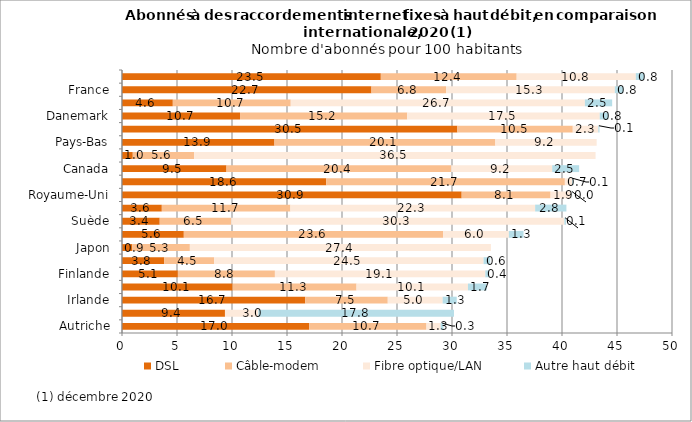
| Category | DSL  | Câble-modem | Fibre optique/LAN | Autre haut débit  |
|---|---|---|---|---|
| Autriche | 17.01 | 10.67 | 1.29 | 0.25 |
| Italie | 9.36 | 0 | 3.03 | 17.79 |
| Irlande | 16.66 | 7.5 | 4.99 | 1.28 |
| OCDE | 10.06 | 11.26 | 10.13 | 1.71 |
| Finlande | 5.08 | 8.82 | 19.13 | 0.35 |
| Espagne | 3.84 | 4.54 | 24.49 | 0.6 |
| Japon | 0.92 | 5.25 | 27.37 | 0 |
| États-Unis | 5.62 | 23.57 | 5.98 | 1.33 |
| Suède | 3.43 | 6.5 | 30.29 | 0.14 |
| Portugal | 3.62 | 11.69 | 22.25 | 2.84 |
| Royaume-Uni | 30.88 | 8.08 | 1.92 | 0.04 |
| Belgique | 18.57 | 21.69 | 0.67 | 0.11 |
| Canada | 9.5 | 20.43 | 9.18 | 2.45 |
| Corée | 0.98 | 5.58 | 36.49 | 0 |
| Pays-Bas | 13.86 | 20.08 | 9.21 | 0 |
| Allemagne | 30.49 | 10.49 | 2.32 | 0.11 |
| Danemark | 10.73 | 15.2 | 17.5 | 0.79 |
| Norvège | 4.62 | 10.72 | 26.74 | 2.48 |
| France | 22.68 | 6.78 | 15.34 | 0.77 |
| Suisse | 23.53 | 12.35 | 10.83 | 0.77 |